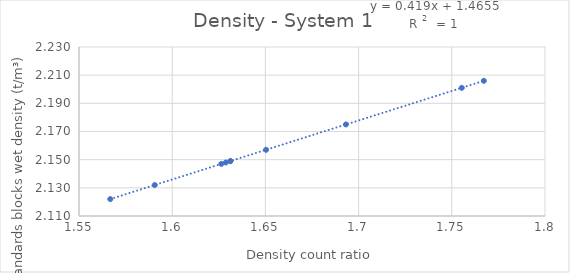
| Category | System 1 |
|---|---|
| 1.755354344419293 | 2.201 |
| 1.6931917116489639 | 2.175 |
| 1.6263277032909629 | 2.147 |
| 1.6503569562946194 | 2.157 |
| 1.7671948458993558 | 2.206 |
| 1.6312032039004005 | 2.149 |
| 1.6287654535956817 | 2.148 |
| 1.5667769458471181 | 2.122 |
| 1.5906320738290092 | 2.132 |
| 1.6312032039004005 | 2.149 |